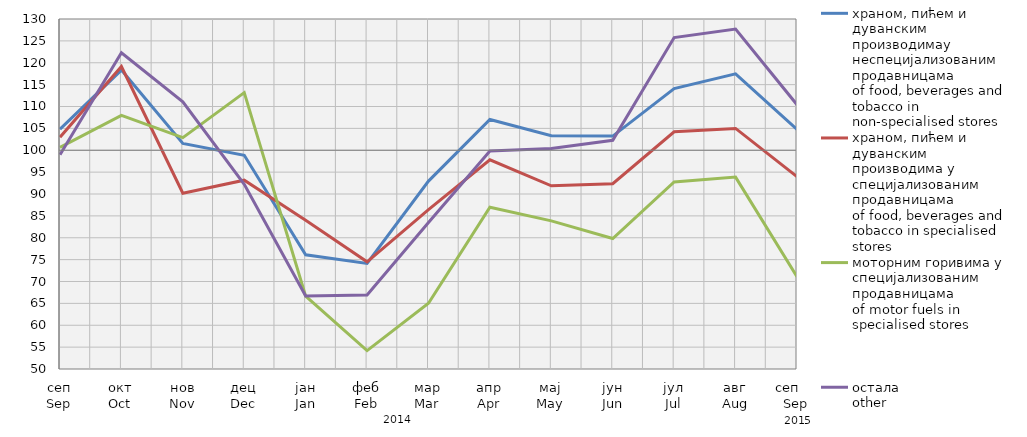
| Category | храном, пићем и дуванским производимау неспецијализованим продавницама
of food, beverages and tobacco in non-specialised stores | храном, пићем и дуванским производима у специјализовaним продавницама
of food, beverages and tobacco in specialised stores | моторним горивима у специјализованим продавницама
of motor fuels in specialised stores | остала
other |
|---|---|---|---|---|
| сеп
Sep | 104.816 | 102.987 | 100.667 | 98.985 |
| окт
Oct | 118.329 | 119.147 | 107.958 | 122.269 |
| нов
Nov | 101.543 | 90.168 | 102.886 | 111.05 |
| дец
Dec | 98.841 | 93.152 | 113.178 | 92.21 |
| јан
Jan | 76.105 | 83.983 | 66.659 | 66.673 |
| феб
Feb | 74.124 | 74.495 | 54.212 | 66.916 |
| мар
Mar | 92.948 | 86.45 | 65.042 | 83.485 |
| апр
Apr | 107.029 | 97.818 | 86.958 | 99.837 |
| мај
May | 103.34 | 91.883 | 83.858 | 100.375 |
| јун
Jun | 103.24 | 92.338 | 79.832 | 102.276 |
| јул
Jul | 114.087 | 104.214 | 92.74 | 125.76 |
| авг
Aug | 117.466 | 104.989 | 93.864 | 127.707 |
| сеп     Sep | 104.752 | 93.955 | 71.088 | 110.411 |